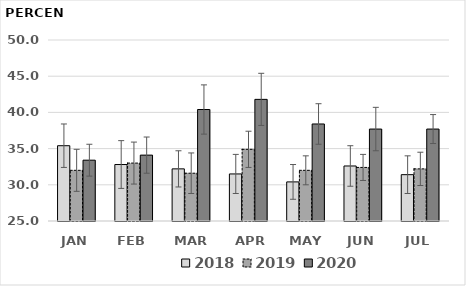
| Category | 2018 | 2019 | 2020 |
|---|---|---|---|
| JAN | 35.4 | 32 | 33.4 |
| FEB | 32.8 | 33 | 34.1 |
| MAR | 32.2 | 31.6 | 40.4 |
| APR | 31.5 | 34.9 | 41.8 |
| MAY | 30.4 | 32 | 38.4 |
| JUN | 32.6 | 32.4 | 37.7 |
| JUL | 31.4 | 32.2 | 37.7 |